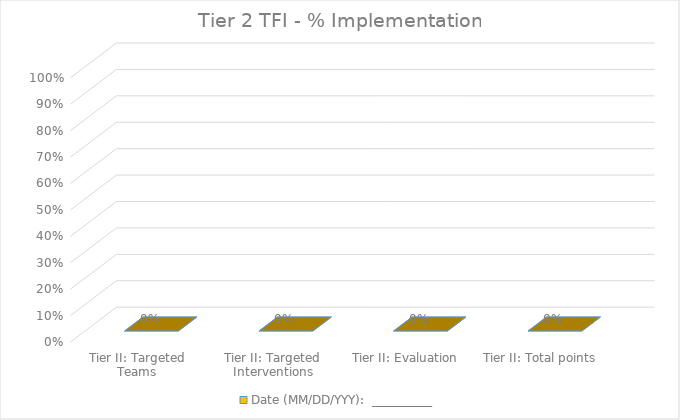
| Category | Date (MM/DD/YYY):  __________ |
|---|---|
| Tier II: Targeted Teams | 0 |
| Tier II: Targeted Interventions | 0 |
| Tier II: Evaluation | 0 |
| Tier II: Total points | 0 |